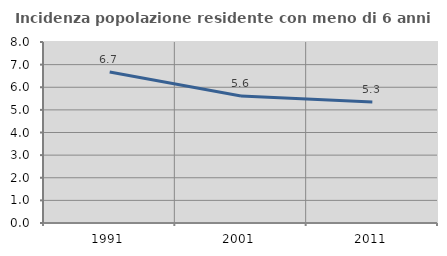
| Category | Incidenza popolazione residente con meno di 6 anni |
|---|---|
| 1991.0 | 6.678 |
| 2001.0 | 5.61 |
| 2011.0 | 5.345 |